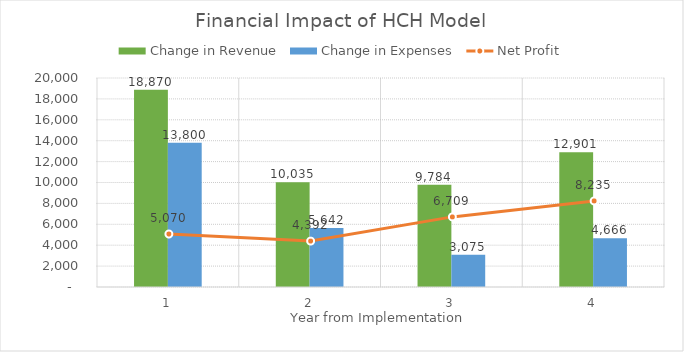
| Category | Change in Revenue | Change in Expenses |
|---|---|---|
| 1.0 | 18869.635 | 13799.869 |
| 2.0 | 10034.711 | 5642.22 |
| 3.0 | 9783.598 | 3074.635 |
| 4.0 | 12901.45 | 4666.027 |